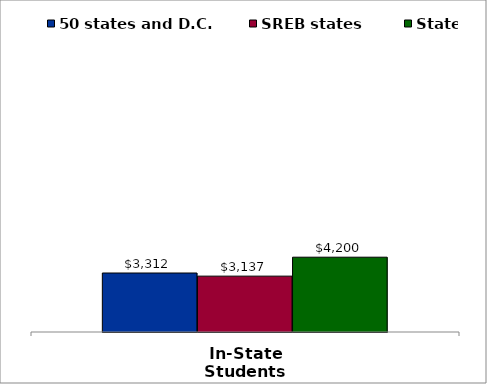
| Category | 50 states and D.C. | SREB states | State |
|---|---|---|---|
| In-State Students | 3312 | 3136.5 | 4200 |